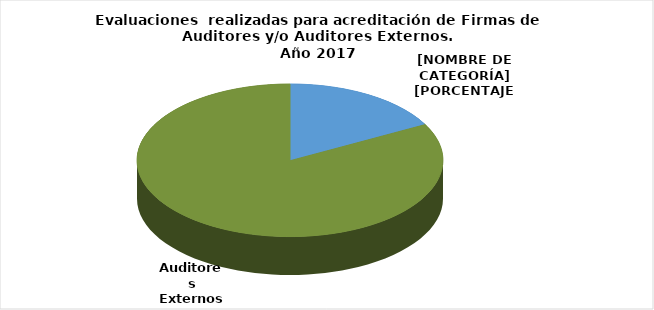
| Category | Series 0 |
|---|---|
| Firmas de Auditores Externos | 6 |
| Auditores Externos | 29 |